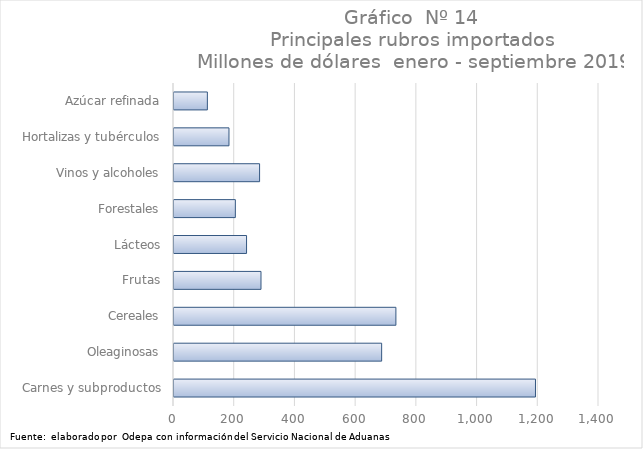
| Category | Series 0 |
|---|---|
| Carnes y subproductos | 1190729.208 |
| Oleaginosas | 684043.861 |
| Cereales | 730964.323 |
| Frutas | 286540.273 |
| Lácteos | 239017.409 |
| Forestales | 202107 |
| Vinos y alcoholes | 281925.117 |
| Hortalizas y tubérculos | 181116.691 |
| Azúcar refinada | 109933.381 |